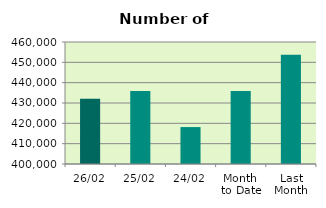
| Category | Series 0 |
|---|---|
| 26/02 | 432116 |
| 25/02 | 435906 |
| 24/02 | 418164 |
| Month 
to Date | 435925.8 |
| Last
Month | 453736.6 |